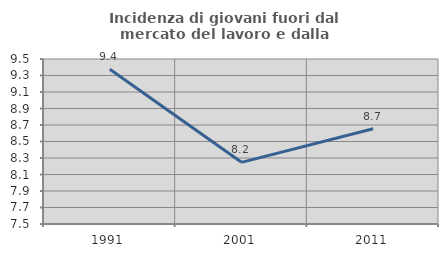
| Category | Incidenza di giovani fuori dal mercato del lavoro e dalla formazione  |
|---|---|
| 1991.0 | 9.375 |
| 2001.0 | 8.247 |
| 2011.0 | 8.654 |